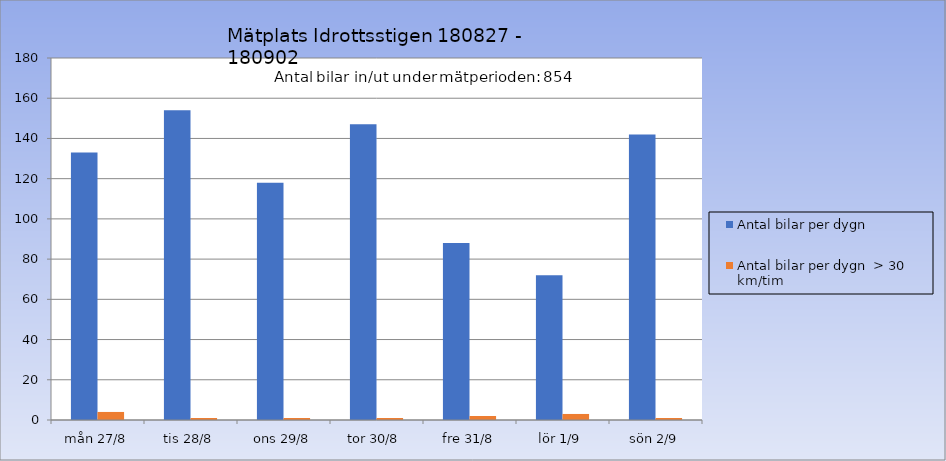
| Category | Antal bilar per dygn | Antal bilar per dygn  > 30 km/tim |
|---|---|---|
| mån 27/8 | 133 | 4 |
| tis 28/8 | 154 | 1 |
| ons 29/8 | 118 | 1 |
| tor 30/8 | 147 | 1 |
| fre 31/8 | 88 | 2 |
| lör 1/9 | 72 | 3 |
| sön 2/9 | 142 | 1 |